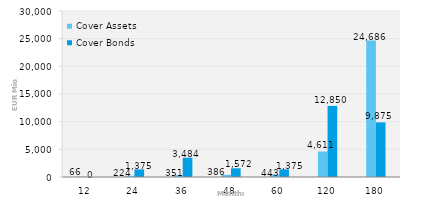
| Category | Cover Assets | Cover Bonds |
|---|---|---|
| 12.0 | 65.814 | 0 |
| 24.0 | 223.883 | 1375 |
| 36.0 | 351.13 | 3484 |
| 48.0 | 385.626 | 1572 |
| 60.0 | 443.02 | 1375 |
| 120.0 | 4611.401 | 12850 |
| 180.0 | 24685.923 | 9875 |